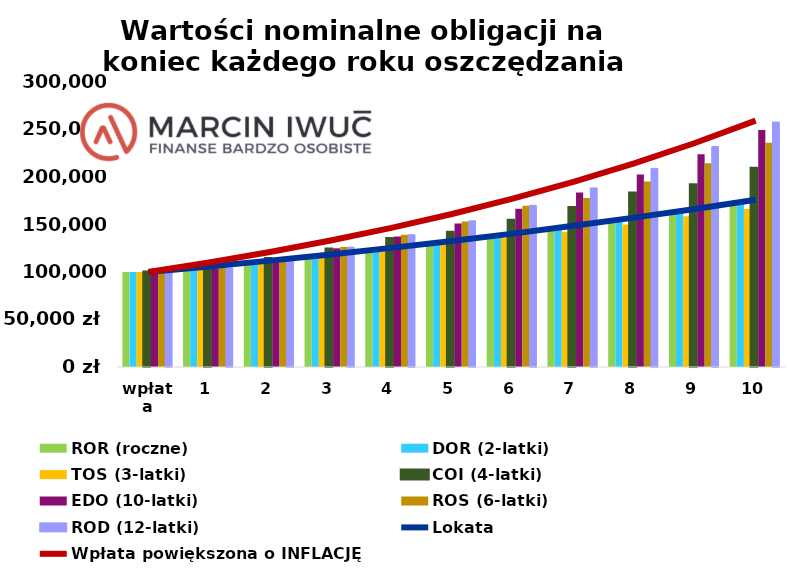
| Category | ROR (roczne) | DOR (2-latki) | TOS (3-latki) | COI (4-latki) | EDO (10-latki) | ROS (6-latki) | ROD (12-latki)  |
|---|---|---|---|---|---|---|---|
| wpłata | 100000 | 100000 | 100000 | 100000 | 100000 | 100000 | 100000 |
| koniec 1 roku | 104991.864 | 104822.784 | 104617 | 104738.5 | 103888 | 104900.5 | 104090.5 |
| koniec 2 roku | 110864.262 | 111107.455 | 110132.776 | 114159.764 | 113836.42 | 115060.431 | 114495.76 |
| koniec 3 roku | 117035.394 | 117095.573 | 116568.562 | 124129.317 | 124928.908 | 126414.154 | 126149.651 |
| koniec 4 roku | 123520.585 | 124116.047 | 122073.54 | 135246.067 | 137297.033 | 139101.94 | 139202.009 |
| koniec 5 roku | 130336.052 | 130848.937 | 128510.179 | 141769.674 | 151087.492 | 153280.541 | 153820.65 |
| koniec 6 roku | 137603.735 | 138693.958 | 136019.855 | 154520.047 | 166463.853 | 169692.127 | 170193.529 |
| koniec 7 roku | 145241.246 | 146143.657 | 142444.045 | 168012.454 | 183608.496 | 178008.736 | 188531.152 |
| koniec 8 roku | 153268.152 | 154905.693 | 149955.099 | 183057.228 | 202724.773 | 195245.653 | 209069.29 |
| koniec 9 roku | 161808.18 | 163257.638 | 158717.924 | 191886.147 | 224039.422 | 214507.571 | 232072.005 |
| koniec 10 roku | 170783.628 | 173045.698 | 166215.179 | 209146.206 | 249425.256 | 236032.409 | 257835.046 |